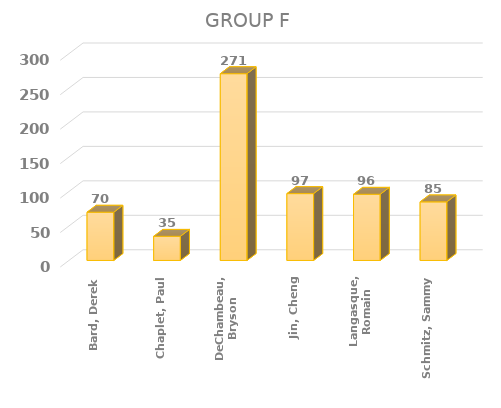
| Category | Series 0 |
|---|---|
| Bard, Derek | 70 |
| Chaplet, Paul | 35 |
| DeChambeau, Bryson | 271 |
| Jin, Cheng | 97 |
| Langasque, Romain | 96 |
| Schmitz, Sammy | 85 |